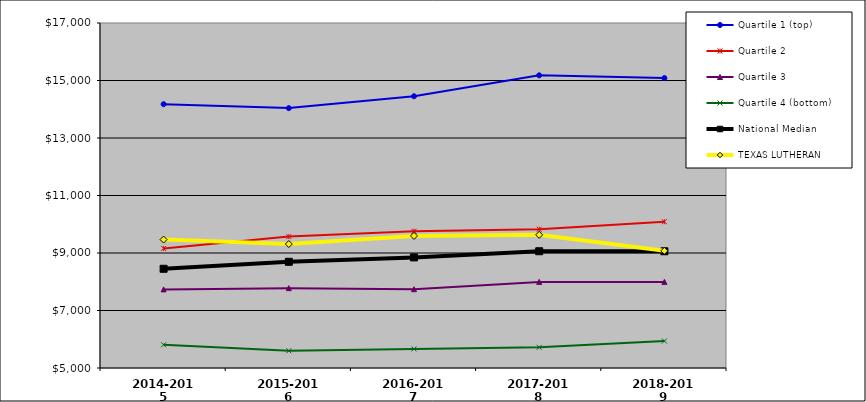
| Category | Quartile 1 (top) | Quartile 2 | Quartile 3 | Quartile 4 (bottom) | National Median | TEXAS LUTHERAN |
|---|---|---|---|---|---|---|
| 2014-2015 | 14176.282 | 9157.362 | 7733.806 | 5808.53 | 8450.558 | 9467.017 |
| 2015-2016 | 14039.484 | 9570.317 | 7777.324 | 5598.928 | 8693.909 | 9310.984 |
| 2016-2017 | 14452.351 | 9756.887 | 7741.317 | 5664.239 | 8846.742 | 9594.193 |
| 2017-2018 | 15180.286 | 9827.122 | 7995.285 | 5719.959 | 9061.41 | 9631.144 |
| 2018-2019 | 15084.564 | 10088.005 | 7995.144 | 5939.492 | 9059.978 | 9075.626 |